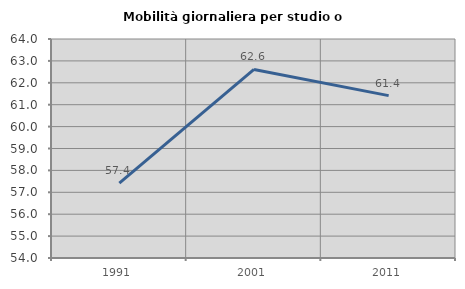
| Category | Mobilità giornaliera per studio o lavoro |
|---|---|
| 1991.0 | 57.416 |
| 2001.0 | 62.611 |
| 2011.0 | 61.414 |